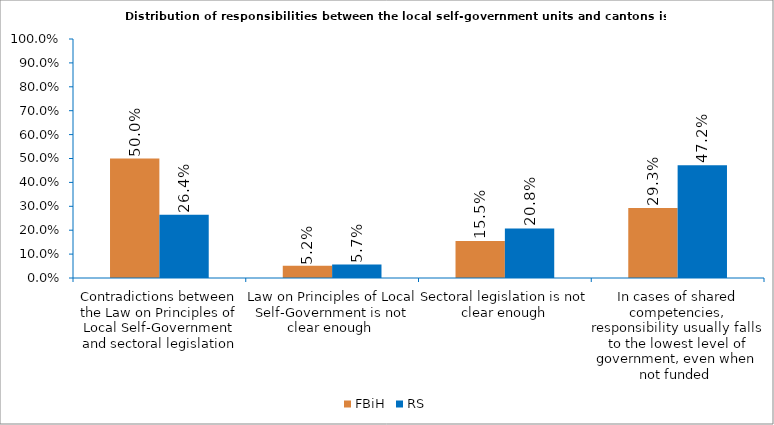
| Category | FBiH | RS |
|---|---|---|
| Contradictions between the Law on Principles of Local Self-Government and sectoral legislation | 0.5 | 0.264 |
| Law on Principles of Local Self-Government is not clear enough  | 0.052 | 0.057 |
| Sectoral legislation is not clear enough | 0.155 | 0.208 |
| In cases of shared competencies, responsibility usually falls to the lowest level of government, even when not funded  | 0.293 | 0.472 |